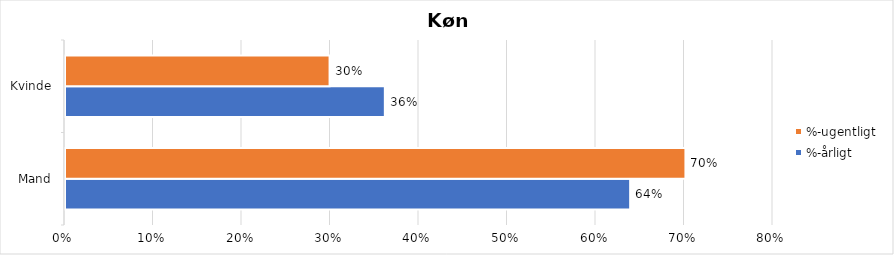
| Category | %-årligt | %-ugentligt |
|---|---|---|
| Mand | 0.639 | 0.701 |
| Kvinde | 0.361 | 0.299 |